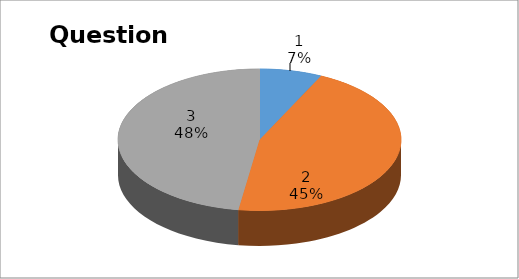
| Category | Series 0 |
|---|---|
| 0 | 3 |
| 1 | 19 |
| 2 | 20 |